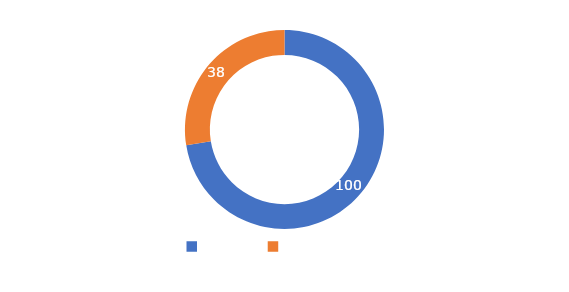
| Category | Series 0 |
|---|---|
| META  | 100 |
| CUMPLIMIENTO | 38 |